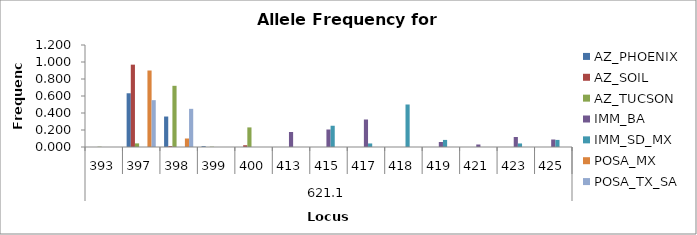
| Category | AZ_PHOENIX | AZ_SOIL | AZ_TUCSON | IMM_BA | IMM_SD_MX | POSA_MX | POSA_TX_SA |
|---|---|---|---|---|---|---|---|
| 0 | 0 | 0 | 0.004 | 0 | 0 | 0 | 0 |
| 1 | 0.632 | 0.969 | 0.043 | 0 | 0 | 0.9 | 0.551 |
| 2 | 0.358 | 0.01 | 0.72 | 0 | 0 | 0.1 | 0.449 |
| 3 | 0.009 | 0 | 0.004 | 0 | 0 | 0 | 0 |
| 4 | 0 | 0.021 | 0.23 | 0 | 0 | 0 | 0 |
| 5 | 0 | 0 | 0 | 0.176 | 0 | 0 | 0 |
| 6 | 0 | 0 | 0 | 0.206 | 0.25 | 0 | 0 |
| 7 | 0 | 0 | 0 | 0.324 | 0.042 | 0 | 0 |
| 8 | 0 | 0 | 0 | 0 | 0.5 | 0 | 0 |
| 9 | 0 | 0 | 0 | 0.059 | 0.083 | 0 | 0 |
| 10 | 0 | 0 | 0 | 0.029 | 0 | 0 | 0 |
| 11 | 0 | 0 | 0 | 0.118 | 0.042 | 0 | 0 |
| 12 | 0 | 0 | 0 | 0.088 | 0.083 | 0 | 0 |